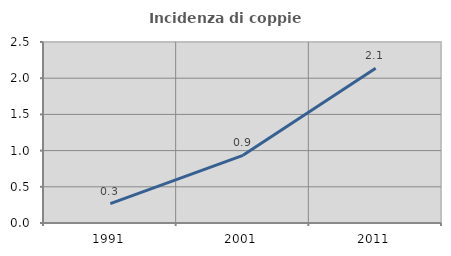
| Category | Incidenza di coppie miste |
|---|---|
| 1991.0 | 0.267 |
| 2001.0 | 0.935 |
| 2011.0 | 2.137 |